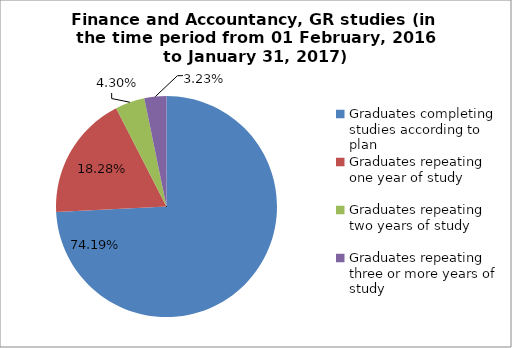
| Category | Series 0 |
|---|---|
| Graduates completing studies according to plan | 74.194 |
| Graduates repeating one year of study | 18.28 |
| Graduates repeating two years of study | 4.301 |
| Graduates repeating three or more years of study | 3.226 |